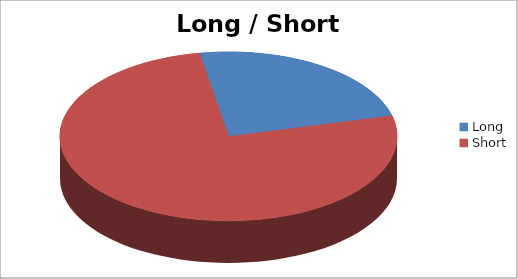
| Category | Series 1 |
|---|---|
| Long | 10 |
| Short | 32 |